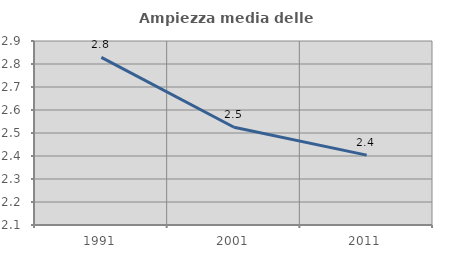
| Category | Ampiezza media delle famiglie |
|---|---|
| 1991.0 | 2.829 |
| 2001.0 | 2.525 |
| 2011.0 | 2.404 |